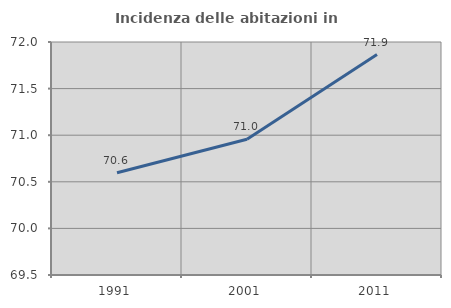
| Category | Incidenza delle abitazioni in proprietà  |
|---|---|
| 1991.0 | 70.597 |
| 2001.0 | 70.956 |
| 2011.0 | 71.865 |